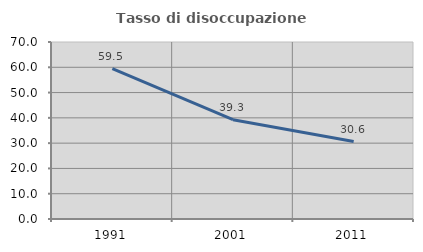
| Category | Tasso di disoccupazione giovanile  |
|---|---|
| 1991.0 | 59.477 |
| 2001.0 | 39.286 |
| 2011.0 | 30.612 |